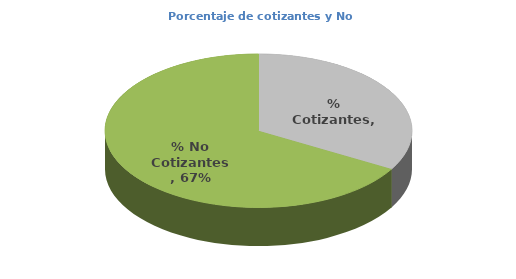
| Category | Series 0 |
|---|---|
| % Cotizantes | 0.333 |
| % No Cotizantes | 0.667 |